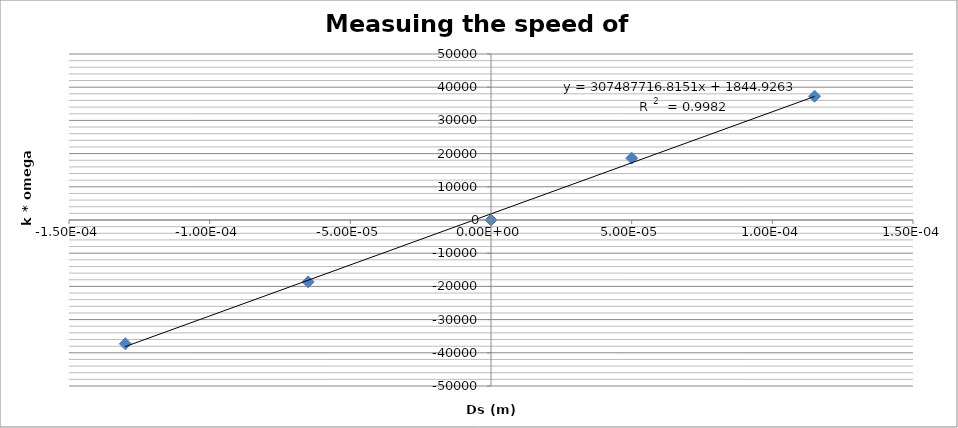
| Category | k*omega |
|---|---|
| -0.000130000000000001 | -37274.627 |
| -6.50000000000013e-05 | -18637.313 |
| 0.0 | 0 |
| 4.99999999999989e-05 | 18637.313 |
| 0.000115 | 37274.627 |